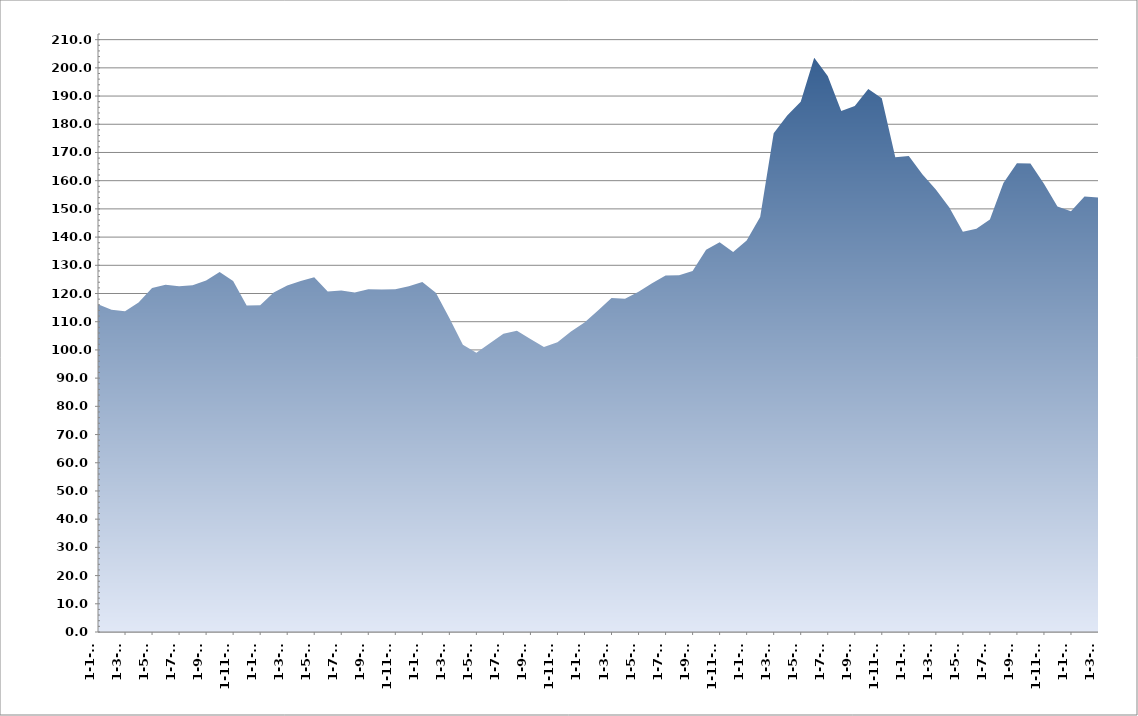
| Category | Series 0 |
|---|---|
| 2018-01-01 | 116.18 |
| 2018-02-01 | 114.28 |
| 2018-03-01 | 113.7 |
| 2018-04-01 | 116.79 |
| 2018-05-01 | 121.91 |
| 2018-06-01 | 123.1 |
| 2018-07-01 | 122.53 |
| 2018-08-01 | 122.91 |
| 2018-09-01 | 124.64 |
| 2018-10-01 | 127.64 |
| 2018-11-01 | 124.42 |
| 2018-12-01 | 115.71 |
| 2019-01-01 | 115.81 |
| 2019-02-01 | 120.36 |
| 2019-03-01 | 122.85 |
| 2019-04-01 | 124.47 |
| 2019-05-01 | 125.78 |
| 2019-06-01 | 120.74 |
| 2019-07-01 | 121.04 |
| 2019-08-01 | 120.4 |
| 2019-09-01 | 121.51 |
| 2019-10-01 | 121.45 |
| 2019-11-01 | 121.54 |
| 2019-12-01 | 122.6 |
| 2020-01-01 | 124.09 |
| 2020-02-01 | 120.27 |
| 2020-03-01 | 111.28 |
| 2020-04-01 | 101.83 |
| 2020-05-01 | 98.97 |
| 2020-06-01 | 102.37 |
| 2020-07-01 | 105.77 |
| 2020-08-01 | 106.77 |
| 2020-09-01 | 103.91 |
| 2020-10-01 | 101.05 |
| 2020-11-01 | 102.76 |
| 2020-12-01 | 106.49 |
| 2021-01-01 | 109.69 |
| 2021-02-01 | 114 |
| 2021-03-01 | 118.38 |
| 2021-04-01 | 118.18 |
| 2021-05-01 | 120.61 |
| 2021-06-01 | 123.6 |
| 2021-07-01 | 126.37 |
| 2021-08-01 | 126.45 |
| 2021-09-01 | 128.01 |
| 2021-10-01 | 135.51 |
| 2021-11-01 | 138.13 |
| 2021-12-01 | 134.69 |
| 2022-01-01 | 138.76 |
| 2022-02-01 | 147.08 |
| 2022-03-01 | 176.82 |
| 2022-04-01 | 183.08 |
| 2022-05-01 | 188 |
| 2022-06-01 | 203.62 |
| 2022-07-01 | 197.14 |
| 2022-08-01 | 184.67 |
| 2022-09-01 | 186.5 |
| 2022-10-01 | 192.52 |
| 2022-11-01 | 189.26 |
| 2022-12-01 | 168.31 |
| 2023-01-01 | 168.77 |
| 2023-02-01 | 162.26 |
| 2023-03-01 | 156.89 |
| 2023-04-01 | 150.52 |
| 2023-05-01 | 141.89 |
| 2023-06-01 | 142.95 |
| 2023-07-01 | 146.23 |
| 2023-08-01 | 159.16 |
| 2023-09-01 | 166.14 |
| 2023-10-01 | 166.12 |
| 2023-11-01 | 158.95 |
| 2023-12-01 | 150.88 |
| 2024-01-01 | 149.16 |
| 2024-02-01 | 154.39 |
| 2024-03-01 | 154.05 |